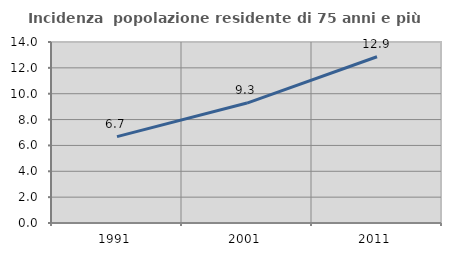
| Category | Incidenza  popolazione residente di 75 anni e più |
|---|---|
| 1991.0 | 6.683 |
| 2001.0 | 9.277 |
| 2011.0 | 12.858 |